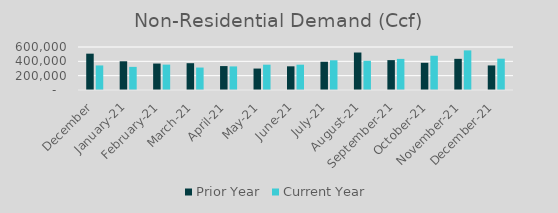
| Category | Prior Year | Current Year |
|---|---|---|
| December | 507022 | 342584.594 |
| January-21 | 400923.849 | 322657.16 |
| February-21 | 369131.684 | 354041 |
| March-21 | 374117 | 313343 |
| April-21 | 333800.488 | 329084.722 |
| May-21 | 299245.56 | 353085 |
| June-21 | 330441.187 | 353141.442 |
| July-21 | 394304.316 | 414577.112 |
| August-21 | 522963.473 | 407774.995 |
| September-21 | 416886.629 | 434192.442 |
| October-21 | 379515 | 477878.526 |
| November-21 | 434815 | 552599.698 |
| December-21 | 342584.594 | 436956.784 |